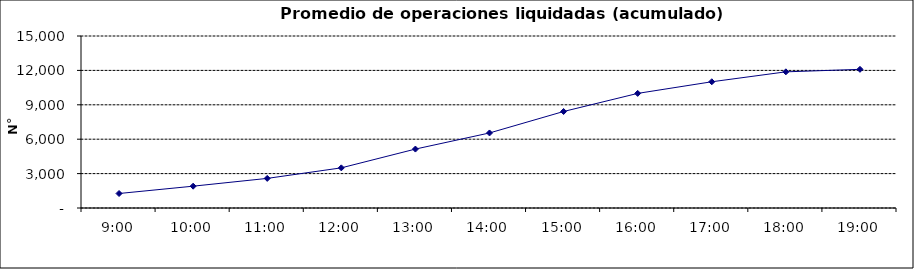
| Category | Promedio Op.Liquidadas (acumulado) |
|---|---|
| 0.375 | 1264.429 |
| 0.4166666666666667 | 1903.429 |
| 0.4583333333333333 | 2581.571 |
| 0.5 | 3500.714 |
| 0.5416666666666666 | 5139.714 |
| 0.5833333333333334 | 6543.619 |
| 0.625 | 8416.714 |
| 0.6666666666666666 | 9994.571 |
| 0.7083333333333334 | 11008.524 |
| 0.75 | 11874.095 |
| 0.7916666666666666 | 12093.238 |